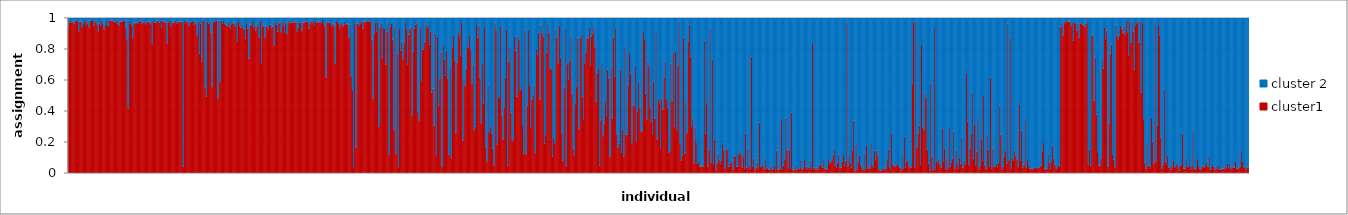
| Category | cluster1 | cluster 2 |
|---|---|---|
| 0 | 0.939 | 0.061 |
| 1 | 0.97 | 0.03 |
| 2 | 0.979 | 0.021 |
| 3 | 0.971 | 0.029 |
| 4 | 0.978 | 0.022 |
| 5 | 0.962 | 0.038 |
| 6 | 0.982 | 0.018 |
| 7 | 0.979 | 0.021 |
| 8 | 0.978 | 0.022 |
| 9 | 0.912 | 0.088 |
| 10 | 0.976 | 0.024 |
| 11 | 0.977 | 0.023 |
| 12 | 0.94 | 0.06 |
| 13 | 0.965 | 0.035 |
| 14 | 0.983 | 0.017 |
| 15 | 0.952 | 0.048 |
| 16 | 0.971 | 0.029 |
| 17 | 0.964 | 0.036 |
| 18 | 0.939 | 0.061 |
| 19 | 0.982 | 0.018 |
| 20 | 0.98 | 0.02 |
| 21 | 0.987 | 0.013 |
| 22 | 0.947 | 0.053 |
| 23 | 0.971 | 0.029 |
| 24 | 0.984 | 0.016 |
| 25 | 0.959 | 0.041 |
| 26 | 0.913 | 0.087 |
| 27 | 0.963 | 0.037 |
| 28 | 0.95 | 0.05 |
| 29 | 0.981 | 0.019 |
| 30 | 0.965 | 0.035 |
| 31 | 0.925 | 0.075 |
| 32 | 0.955 | 0.045 |
| 33 | 0.98 | 0.02 |
| 34 | 0.947 | 0.053 |
| 35 | 0.947 | 0.053 |
| 36 | 0.984 | 0.016 |
| 37 | 0.985 | 0.015 |
| 38 | 0.979 | 0.021 |
| 39 | 0.979 | 0.021 |
| 40 | 0.976 | 0.024 |
| 41 | 0.969 | 0.031 |
| 42 | 0.983 | 0.017 |
| 43 | 0.964 | 0.036 |
| 44 | 0.951 | 0.049 |
| 45 | 0.977 | 0.023 |
| 46 | 0.974 | 0.026 |
| 47 | 0.976 | 0.024 |
| 48 | 0.984 | 0.016 |
| 49 | 0.982 | 0.018 |
| 50 | 0.935 | 0.065 |
| 51 | 0.864 | 0.136 |
| 52 | 0.415 | 0.585 |
| 53 | 0.98 | 0.02 |
| 54 | 0.965 | 0.035 |
| 55 | 0.949 | 0.051 |
| 56 | 0.868 | 0.132 |
| 57 | 0.963 | 0.037 |
| 58 | 0.968 | 0.032 |
| 59 | 0.968 | 0.032 |
| 60 | 0.963 | 0.037 |
| 61 | 0.973 | 0.027 |
| 62 | 0.974 | 0.026 |
| 63 | 0.983 | 0.017 |
| 64 | 0.964 | 0.036 |
| 65 | 0.97 | 0.03 |
| 66 | 0.972 | 0.028 |
| 67 | 0.965 | 0.035 |
| 68 | 0.958 | 0.042 |
| 69 | 0.977 | 0.023 |
| 70 | 0.975 | 0.025 |
| 71 | 0.965 | 0.035 |
| 72 | 0.972 | 0.028 |
| 73 | 0.83 | 0.17 |
| 74 | 0.98 | 0.02 |
| 75 | 0.969 | 0.031 |
| 76 | 0.971 | 0.029 |
| 77 | 0.981 | 0.019 |
| 78 | 0.979 | 0.021 |
| 79 | 0.97 | 0.03 |
| 80 | 0.984 | 0.016 |
| 81 | 0.937 | 0.063 |
| 82 | 0.981 | 0.019 |
| 83 | 0.976 | 0.024 |
| 84 | 0.971 | 0.029 |
| 85 | 0.971 | 0.029 |
| 86 | 0.835 | 0.165 |
| 87 | 0.972 | 0.028 |
| 88 | 0.979 | 0.021 |
| 89 | 0.945 | 0.055 |
| 90 | 0.979 | 0.021 |
| 91 | 0.969 | 0.031 |
| 92 | 0.967 | 0.033 |
| 93 | 0.98 | 0.02 |
| 94 | 0.966 | 0.034 |
| 95 | 0.964 | 0.036 |
| 96 | 0.974 | 0.026 |
| 97 | 0.975 | 0.025 |
| 98 | 0.977 | 0.023 |
| 99 | 0.976 | 0.024 |
| 100 | 0.041 | 0.959 |
| 101 | 0.98 | 0.02 |
| 102 | 0.965 | 0.035 |
| 103 | 0.979 | 0.021 |
| 104 | 0.976 | 0.024 |
| 105 | 0.948 | 0.052 |
| 106 | 0.973 | 0.027 |
| 107 | 0.973 | 0.027 |
| 108 | 0.981 | 0.019 |
| 109 | 0.958 | 0.042 |
| 110 | 0.981 | 0.019 |
| 111 | 0.961 | 0.039 |
| 112 | 0.886 | 0.114 |
| 113 | 0.975 | 0.025 |
| 114 | 0.77 | 0.23 |
| 115 | 0.964 | 0.036 |
| 116 | 0.719 | 0.281 |
| 117 | 0.987 | 0.013 |
| 118 | 0.979 | 0.021 |
| 119 | 0.549 | 0.451 |
| 120 | 0.491 | 0.509 |
| 121 | 0.976 | 0.024 |
| 122 | 0.962 | 0.038 |
| 123 | 0.973 | 0.027 |
| 124 | 0.906 | 0.094 |
| 125 | 0.553 | 0.447 |
| 126 | 0.97 | 0.03 |
| 127 | 0.982 | 0.018 |
| 128 | 0.974 | 0.026 |
| 129 | 0.984 | 0.016 |
| 130 | 0.48 | 0.52 |
| 131 | 0.982 | 0.018 |
| 132 | 0.586 | 0.414 |
| 133 | 0.98 | 0.02 |
| 134 | 0.963 | 0.037 |
| 135 | 0.98 | 0.02 |
| 136 | 0.964 | 0.036 |
| 137 | 0.955 | 0.045 |
| 138 | 0.946 | 0.054 |
| 139 | 0.972 | 0.028 |
| 140 | 0.943 | 0.057 |
| 141 | 0.93 | 0.07 |
| 142 | 0.959 | 0.041 |
| 143 | 0.97 | 0.03 |
| 144 | 0.963 | 0.037 |
| 145 | 0.944 | 0.056 |
| 146 | 0.969 | 0.031 |
| 147 | 0.848 | 0.152 |
| 148 | 0.979 | 0.021 |
| 149 | 0.948 | 0.052 |
| 150 | 0.937 | 0.063 |
| 151 | 0.972 | 0.028 |
| 152 | 0.932 | 0.068 |
| 153 | 0.926 | 0.074 |
| 154 | 0.866 | 0.134 |
| 155 | 0.961 | 0.039 |
| 156 | 0.928 | 0.072 |
| 157 | 0.737 | 0.263 |
| 158 | 0.952 | 0.048 |
| 159 | 0.953 | 0.047 |
| 160 | 0.979 | 0.021 |
| 161 | 0.935 | 0.065 |
| 162 | 0.951 | 0.049 |
| 163 | 0.917 | 0.083 |
| 164 | 0.946 | 0.054 |
| 165 | 0.963 | 0.037 |
| 166 | 0.873 | 0.127 |
| 167 | 0.98 | 0.02 |
| 168 | 0.703 | 0.297 |
| 169 | 0.942 | 0.058 |
| 170 | 0.956 | 0.044 |
| 171 | 0.874 | 0.126 |
| 172 | 0.947 | 0.053 |
| 173 | 0.94 | 0.06 |
| 174 | 0.925 | 0.075 |
| 175 | 0.954 | 0.046 |
| 176 | 0.954 | 0.046 |
| 177 | 0.937 | 0.063 |
| 178 | 0.946 | 0.054 |
| 179 | 0.82 | 0.18 |
| 180 | 0.971 | 0.029 |
| 181 | 0.956 | 0.044 |
| 182 | 0.911 | 0.089 |
| 183 | 0.966 | 0.034 |
| 184 | 0.971 | 0.029 |
| 185 | 0.907 | 0.093 |
| 186 | 0.977 | 0.023 |
| 187 | 0.946 | 0.054 |
| 188 | 0.903 | 0.097 |
| 189 | 0.97 | 0.03 |
| 190 | 0.895 | 0.105 |
| 191 | 0.965 | 0.035 |
| 192 | 0.984 | 0.016 |
| 193 | 0.968 | 0.032 |
| 194 | 0.969 | 0.031 |
| 195 | 0.971 | 0.029 |
| 196 | 0.968 | 0.032 |
| 197 | 0.974 | 0.026 |
| 198 | 0.97 | 0.03 |
| 199 | 0.912 | 0.088 |
| 200 | 0.934 | 0.066 |
| 201 | 0.97 | 0.03 |
| 202 | 0.971 | 0.029 |
| 203 | 0.915 | 0.085 |
| 204 | 0.969 | 0.031 |
| 205 | 0.97 | 0.03 |
| 206 | 0.974 | 0.026 |
| 207 | 0.976 | 0.024 |
| 208 | 0.974 | 0.026 |
| 209 | 0.929 | 0.071 |
| 210 | 0.964 | 0.036 |
| 211 | 0.981 | 0.019 |
| 212 | 0.967 | 0.033 |
| 213 | 0.981 | 0.019 |
| 214 | 0.953 | 0.047 |
| 215 | 0.978 | 0.022 |
| 216 | 0.968 | 0.032 |
| 217 | 0.977 | 0.023 |
| 218 | 0.969 | 0.031 |
| 219 | 0.977 | 0.023 |
| 220 | 0.966 | 0.034 |
| 221 | 0.985 | 0.015 |
| 222 | 0.965 | 0.035 |
| 223 | 0.95 | 0.05 |
| 224 | 0.614 | 0.386 |
| 225 | 0.972 | 0.028 |
| 226 | 0.971 | 0.029 |
| 227 | 0.966 | 0.034 |
| 228 | 0.97 | 0.03 |
| 229 | 0.947 | 0.053 |
| 230 | 0.962 | 0.038 |
| 231 | 0.952 | 0.048 |
| 232 | 0.702 | 0.298 |
| 233 | 0.979 | 0.021 |
| 234 | 0.977 | 0.023 |
| 235 | 0.963 | 0.037 |
| 236 | 0.933 | 0.067 |
| 237 | 0.969 | 0.031 |
| 238 | 0.956 | 0.044 |
| 239 | 0.945 | 0.055 |
| 240 | 0.973 | 0.027 |
| 241 | 0.957 | 0.043 |
| 242 | 0.962 | 0.038 |
| 243 | 0.957 | 0.043 |
| 244 | 0.873 | 0.127 |
| 245 | 0.953 | 0.047 |
| 246 | 0.625 | 0.375 |
| 247 | 0.533 | 0.467 |
| 248 | 0.03 | 0.97 |
| 249 | 0.966 | 0.034 |
| 250 | 0.161 | 0.839 |
| 251 | 0.964 | 0.036 |
| 252 | 0.965 | 0.035 |
| 253 | 0.952 | 0.048 |
| 254 | 0.965 | 0.035 |
| 255 | 0.976 | 0.024 |
| 256 | 0.931 | 0.069 |
| 257 | 0.977 | 0.023 |
| 258 | 0.974 | 0.026 |
| 259 | 0.975 | 0.025 |
| 260 | 0.981 | 0.019 |
| 261 | 0.976 | 0.024 |
| 262 | 0.978 | 0.022 |
| 263 | 0.978 | 0.022 |
| 264 | 0.857 | 0.143 |
| 265 | 0.478 | 0.522 |
| 266 | 0.9 | 0.1 |
| 267 | 0.969 | 0.031 |
| 268 | 0.909 | 0.091 |
| 269 | 0.97 | 0.03 |
| 270 | 0.298 | 0.702 |
| 271 | 0.94 | 0.06 |
| 272 | 0.962 | 0.038 |
| 273 | 0.741 | 0.259 |
| 274 | 0.934 | 0.066 |
| 275 | 0.928 | 0.072 |
| 276 | 0.698 | 0.302 |
| 277 | 0.908 | 0.092 |
| 278 | 0.968 | 0.032 |
| 279 | 0.117 | 0.883 |
| 280 | 0.94 | 0.06 |
| 281 | 0.962 | 0.038 |
| 282 | 0.859 | 0.141 |
| 283 | 0.276 | 0.724 |
| 284 | 0.944 | 0.056 |
| 285 | 0.121 | 0.879 |
| 286 | 0.768 | 0.232 |
| 287 | 0.038 | 0.962 |
| 288 | 0.927 | 0.073 |
| 289 | 0.79 | 0.21 |
| 290 | 0.847 | 0.153 |
| 291 | 0.734 | 0.266 |
| 292 | 0.835 | 0.165 |
| 293 | 0.973 | 0.027 |
| 294 | 0.927 | 0.073 |
| 295 | 0.696 | 0.304 |
| 296 | 0.892 | 0.108 |
| 297 | 0.928 | 0.072 |
| 298 | 0.943 | 0.057 |
| 299 | 0.366 | 0.634 |
| 300 | 0.783 | 0.217 |
| 301 | 0.929 | 0.071 |
| 302 | 0.957 | 0.043 |
| 303 | 0.965 | 0.035 |
| 304 | 0.394 | 0.606 |
| 305 | 0.338 | 0.662 |
| 306 | 0.945 | 0.055 |
| 307 | 0.593 | 0.407 |
| 308 | 0.795 | 0.205 |
| 309 | 0.794 | 0.206 |
| 310 | 0.847 | 0.153 |
| 311 | 0.959 | 0.041 |
| 312 | 0.934 | 0.066 |
| 313 | 0.954 | 0.046 |
| 314 | 0.826 | 0.174 |
| 315 | 0.911 | 0.089 |
| 316 | 0.518 | 0.482 |
| 317 | 0.543 | 0.457 |
| 318 | 0.303 | 0.697 |
| 319 | 0.899 | 0.101 |
| 320 | 0.108 | 0.892 |
| 321 | 0.879 | 0.121 |
| 322 | 0.432 | 0.568 |
| 323 | 0.605 | 0.395 |
| 324 | 0.779 | 0.221 |
| 325 | 0.038 | 0.962 |
| 326 | 0.823 | 0.177 |
| 327 | 0.731 | 0.269 |
| 328 | 0.628 | 0.372 |
| 329 | 0.786 | 0.214 |
| 330 | 0.606 | 0.394 |
| 331 | 0.117 | 0.883 |
| 332 | 0.678 | 0.322 |
| 333 | 0.098 | 0.902 |
| 334 | 0.805 | 0.195 |
| 335 | 0.887 | 0.113 |
| 336 | 0.726 | 0.274 |
| 337 | 0.255 | 0.745 |
| 338 | 0.71 | 0.29 |
| 339 | 0.911 | 0.089 |
| 340 | 0.882 | 0.118 |
| 341 | 0.753 | 0.247 |
| 342 | 0.971 | 0.029 |
| 343 | 0.207 | 0.793 |
| 344 | 0.603 | 0.397 |
| 345 | 0.562 | 0.438 |
| 346 | 0.669 | 0.331 |
| 347 | 0.816 | 0.184 |
| 348 | 0.806 | 0.194 |
| 349 | 0.889 | 0.111 |
| 350 | 0.792 | 0.208 |
| 351 | 0.576 | 0.424 |
| 352 | 0.696 | 0.304 |
| 353 | 0.274 | 0.726 |
| 354 | 0.298 | 0.702 |
| 355 | 0.952 | 0.048 |
| 356 | 0.873 | 0.127 |
| 357 | 0.948 | 0.052 |
| 358 | 0.61 | 0.39 |
| 359 | 0.32 | 0.68 |
| 360 | 0.703 | 0.297 |
| 361 | 0.446 | 0.554 |
| 362 | 0.94 | 0.06 |
| 363 | 0.165 | 0.835 |
| 364 | 0.073 | 0.927 |
| 365 | 0.568 | 0.432 |
| 366 | 0.263 | 0.737 |
| 367 | 0.299 | 0.701 |
| 368 | 0.251 | 0.749 |
| 369 | 0.156 | 0.844 |
| 370 | 0.048 | 0.952 |
| 371 | 0.968 | 0.032 |
| 372 | 0.919 | 0.081 |
| 373 | 0.182 | 0.818 |
| 374 | 0.488 | 0.512 |
| 375 | 0.482 | 0.518 |
| 376 | 0.947 | 0.053 |
| 377 | 0.369 | 0.631 |
| 378 | 0.215 | 0.785 |
| 379 | 0.422 | 0.578 |
| 380 | 0.615 | 0.385 |
| 381 | 0.925 | 0.075 |
| 382 | 0.047 | 0.953 |
| 383 | 0.714 | 0.286 |
| 384 | 0.809 | 0.191 |
| 385 | 0.386 | 0.614 |
| 386 | 0.201 | 0.799 |
| 387 | 0.217 | 0.783 |
| 388 | 0.879 | 0.121 |
| 389 | 0.789 | 0.211 |
| 390 | 0.491 | 0.509 |
| 391 | 0.882 | 0.118 |
| 392 | 0.857 | 0.143 |
| 393 | 0.534 | 0.466 |
| 394 | 0.54 | 0.46 |
| 395 | 0.301 | 0.699 |
| 396 | 0.124 | 0.876 |
| 397 | 0.921 | 0.079 |
| 398 | 0.12 | 0.88 |
| 399 | 0.432 | 0.568 |
| 400 | 0.921 | 0.079 |
| 401 | 0.56 | 0.44 |
| 402 | 0.294 | 0.706 |
| 403 | 0.472 | 0.528 |
| 404 | 0.499 | 0.501 |
| 405 | 0.565 | 0.435 |
| 406 | 0.127 | 0.873 |
| 407 | 0.798 | 0.202 |
| 408 | 0.763 | 0.237 |
| 409 | 0.906 | 0.094 |
| 410 | 0.471 | 0.529 |
| 411 | 0.955 | 0.045 |
| 412 | 0.902 | 0.098 |
| 413 | 0.88 | 0.12 |
| 414 | 0.189 | 0.811 |
| 415 | 0.243 | 0.757 |
| 416 | 0.777 | 0.223 |
| 417 | 0.959 | 0.041 |
| 418 | 0.905 | 0.095 |
| 419 | 0.673 | 0.327 |
| 420 | 0.668 | 0.332 |
| 421 | 0.105 | 0.895 |
| 422 | 0.226 | 0.774 |
| 423 | 0.191 | 0.809 |
| 424 | 0.924 | 0.076 |
| 425 | 0.87 | 0.13 |
| 426 | 0.706 | 0.294 |
| 427 | 0.948 | 0.052 |
| 428 | 0.743 | 0.257 |
| 429 | 0.257 | 0.743 |
| 430 | 0.077 | 0.923 |
| 431 | 0.547 | 0.453 |
| 432 | 0.932 | 0.068 |
| 433 | 0.043 | 0.957 |
| 434 | 0.701 | 0.299 |
| 435 | 0.6 | 0.4 |
| 436 | 0.72 | 0.28 |
| 437 | 0.877 | 0.123 |
| 438 | 0.508 | 0.492 |
| 439 | 0.156 | 0.844 |
| 440 | 0.108 | 0.892 |
| 441 | 0.444 | 0.556 |
| 442 | 0.554 | 0.446 |
| 443 | 0.871 | 0.129 |
| 444 | 0.281 | 0.719 |
| 445 | 0.871 | 0.129 |
| 446 | 0.89 | 0.11 |
| 447 | 0.489 | 0.511 |
| 448 | 0.341 | 0.659 |
| 449 | 0.708 | 0.292 |
| 450 | 0.777 | 0.223 |
| 451 | 0.869 | 0.131 |
| 452 | 0.868 | 0.132 |
| 453 | 0.936 | 0.064 |
| 454 | 0.69 | 0.31 |
| 455 | 0.88 | 0.12 |
| 456 | 0.9 | 0.1 |
| 457 | 0.946 | 0.054 |
| 458 | 0.811 | 0.189 |
| 459 | 0.454 | 0.546 |
| 460 | 0.645 | 0.355 |
| 461 | 0.669 | 0.331 |
| 462 | 0.047 | 0.953 |
| 463 | 0.34 | 0.66 |
| 464 | 0.713 | 0.287 |
| 465 | 0.237 | 0.763 |
| 466 | 0.316 | 0.684 |
| 467 | 0.456 | 0.544 |
| 468 | 0.368 | 0.632 |
| 469 | 0.666 | 0.334 |
| 470 | 0.611 | 0.389 |
| 471 | 0.104 | 0.896 |
| 472 | 0.678 | 0.322 |
| 473 | 0.348 | 0.652 |
| 474 | 0.87 | 0.13 |
| 475 | 0.621 | 0.379 |
| 476 | 0.934 | 0.066 |
| 477 | 0.249 | 0.751 |
| 478 | 0.161 | 0.839 |
| 479 | 0.188 | 0.812 |
| 480 | 0.667 | 0.333 |
| 481 | 0.128 | 0.872 |
| 482 | 0.276 | 0.724 |
| 483 | 0.106 | 0.894 |
| 484 | 0.816 | 0.184 |
| 485 | 0.244 | 0.756 |
| 486 | 0.245 | 0.755 |
| 487 | 0.56 | 0.44 |
| 488 | 0.772 | 0.228 |
| 489 | 0.639 | 0.361 |
| 490 | 0.192 | 0.808 |
| 491 | 0.441 | 0.559 |
| 492 | 0.43 | 0.57 |
| 493 | 0.689 | 0.311 |
| 494 | 0.201 | 0.799 |
| 495 | 0.392 | 0.608 |
| 496 | 0.585 | 0.415 |
| 497 | 0.422 | 0.578 |
| 498 | 0.264 | 0.736 |
| 499 | 0.269 | 0.731 |
| 500 | 0.912 | 0.088 |
| 501 | 0.863 | 0.137 |
| 502 | 0.51 | 0.49 |
| 503 | 0.344 | 0.656 |
| 504 | 0.717 | 0.283 |
| 505 | 0.686 | 0.314 |
| 506 | 0.421 | 0.579 |
| 507 | 0.327 | 0.673 |
| 508 | 0.253 | 0.747 |
| 509 | 0.591 | 0.409 |
| 510 | 0.348 | 0.652 |
| 511 | 0.925 | 0.075 |
| 512 | 0.214 | 0.786 |
| 513 | 0.478 | 0.522 |
| 514 | 0.456 | 0.544 |
| 515 | 0.158 | 0.842 |
| 516 | 0.477 | 0.523 |
| 517 | 0.409 | 0.591 |
| 518 | 0.615 | 0.385 |
| 519 | 0.719 | 0.281 |
| 520 | 0.474 | 0.526 |
| 521 | 0.419 | 0.581 |
| 522 | 0.128 | 0.872 |
| 523 | 0.135 | 0.865 |
| 524 | 0.707 | 0.293 |
| 525 | 0.461 | 0.539 |
| 526 | 0.773 | 0.227 |
| 527 | 0.296 | 0.704 |
| 528 | 0.78 | 0.22 |
| 529 | 0.276 | 0.724 |
| 530 | 0.693 | 0.307 |
| 531 | 0.977 | 0.023 |
| 532 | 0.186 | 0.814 |
| 533 | 0.078 | 0.922 |
| 534 | 0.111 | 0.889 |
| 535 | 0.872 | 0.128 |
| 536 | 0.122 | 0.878 |
| 537 | 0.456 | 0.544 |
| 538 | 0.256 | 0.744 |
| 539 | 0.849 | 0.151 |
| 540 | 0.955 | 0.045 |
| 541 | 0.748 | 0.252 |
| 542 | 0.295 | 0.705 |
| 543 | 0.349 | 0.651 |
| 544 | 0.061 | 0.939 |
| 545 | 0.29 | 0.71 |
| 546 | 0.197 | 0.803 |
| 547 | 0.061 | 0.939 |
| 548 | 0.071 | 0.929 |
| 549 | 0.042 | 0.958 |
| 550 | 0.039 | 0.961 |
| 551 | 0.045 | 0.955 |
| 552 | 0.041 | 0.959 |
| 553 | 0.852 | 0.148 |
| 554 | 0.252 | 0.748 |
| 555 | 0.452 | 0.548 |
| 556 | 0.04 | 0.96 |
| 557 | 0.146 | 0.854 |
| 558 | 0.933 | 0.067 |
| 559 | 0.066 | 0.934 |
| 560 | 0.729 | 0.271 |
| 561 | 0.056 | 0.944 |
| 562 | 0.211 | 0.789 |
| 563 | 0.017 | 0.983 |
| 564 | 0.065 | 0.935 |
| 565 | 0.124 | 0.876 |
| 566 | 0.086 | 0.914 |
| 567 | 0.056 | 0.944 |
| 568 | 0.079 | 0.921 |
| 569 | 0.186 | 0.814 |
| 570 | 0.148 | 0.852 |
| 571 | 0.029 | 0.971 |
| 572 | 0.158 | 0.842 |
| 573 | 0.147 | 0.853 |
| 574 | 0.038 | 0.962 |
| 575 | 0.041 | 0.959 |
| 576 | 0.066 | 0.934 |
| 577 | 0.076 | 0.924 |
| 578 | 0.021 | 0.979 |
| 579 | 0.111 | 0.889 |
| 580 | 0.106 | 0.894 |
| 581 | 0.038 | 0.962 |
| 582 | 0.039 | 0.961 |
| 583 | 0.125 | 0.875 |
| 584 | 0.147 | 0.853 |
| 585 | 0.114 | 0.886 |
| 586 | 0.033 | 0.967 |
| 587 | 0.107 | 0.893 |
| 588 | 0.025 | 0.975 |
| 589 | 0.254 | 0.746 |
| 590 | 0.032 | 0.968 |
| 591 | 0.155 | 0.845 |
| 592 | 0.043 | 0.957 |
| 593 | 0.023 | 0.977 |
| 594 | 0.748 | 0.252 |
| 595 | 0.037 | 0.963 |
| 596 | 0.092 | 0.908 |
| 597 | 0.017 | 0.983 |
| 598 | 0.035 | 0.965 |
| 599 | 0.065 | 0.935 |
| 600 | 0.029 | 0.971 |
| 601 | 0.324 | 0.676 |
| 602 | 0.037 | 0.963 |
| 603 | 0.045 | 0.955 |
| 604 | 0.056 | 0.944 |
| 605 | 0.022 | 0.978 |
| 606 | 0.091 | 0.909 |
| 607 | 0.028 | 0.972 |
| 608 | 0.033 | 0.967 |
| 609 | 0.02 | 0.98 |
| 610 | 0.023 | 0.977 |
| 611 | 0.046 | 0.954 |
| 612 | 0.021 | 0.979 |
| 613 | 0.025 | 0.975 |
| 614 | 0.05 | 0.95 |
| 615 | 0.016 | 0.984 |
| 616 | 0.142 | 0.858 |
| 617 | 0.019 | 0.981 |
| 618 | 0.023 | 0.977 |
| 619 | 0.027 | 0.973 |
| 620 | 0.347 | 0.653 |
| 621 | 0.018 | 0.982 |
| 622 | 0.046 | 0.954 |
| 623 | 0.087 | 0.913 |
| 624 | 0.356 | 0.644 |
| 625 | 0.145 | 0.855 |
| 626 | 0.031 | 0.969 |
| 627 | 0.149 | 0.851 |
| 628 | 0.024 | 0.976 |
| 629 | 0.389 | 0.611 |
| 630 | 0.017 | 0.983 |
| 631 | 0.02 | 0.98 |
| 632 | 0.05 | 0.95 |
| 633 | 0.018 | 0.982 |
| 634 | 0.02 | 0.98 |
| 635 | 0.03 | 0.97 |
| 636 | 0.028 | 0.972 |
| 637 | 0.082 | 0.918 |
| 638 | 0.023 | 0.977 |
| 639 | 0.027 | 0.973 |
| 640 | 0.088 | 0.912 |
| 641 | 0.036 | 0.964 |
| 642 | 0.021 | 0.979 |
| 643 | 0.041 | 0.959 |
| 644 | 0.032 | 0.968 |
| 645 | 0.079 | 0.921 |
| 646 | 0.029 | 0.971 |
| 647 | 0.842 | 0.158 |
| 648 | 0.022 | 0.978 |
| 649 | 0.033 | 0.967 |
| 650 | 0.021 | 0.979 |
| 651 | 0.032 | 0.968 |
| 652 | 0.02 | 0.98 |
| 653 | 0.049 | 0.951 |
| 654 | 0.055 | 0.945 |
| 655 | 0.042 | 0.958 |
| 656 | 0.032 | 0.968 |
| 657 | 0.089 | 0.911 |
| 658 | 0.026 | 0.974 |
| 659 | 0.025 | 0.975 |
| 660 | 0.021 | 0.979 |
| 661 | 0.081 | 0.919 |
| 662 | 0.057 | 0.943 |
| 663 | 0.069 | 0.931 |
| 664 | 0.081 | 0.919 |
| 665 | 0.115 | 0.885 |
| 666 | 0.154 | 0.846 |
| 667 | 0.046 | 0.954 |
| 668 | 0.033 | 0.967 |
| 669 | 0.067 | 0.933 |
| 670 | 0.115 | 0.885 |
| 671 | 0.03 | 0.97 |
| 672 | 0.034 | 0.966 |
| 673 | 0.071 | 0.929 |
| 674 | 0.115 | 0.885 |
| 675 | 0.042 | 0.958 |
| 676 | 0.078 | 0.922 |
| 677 | 0.97 | 0.03 |
| 678 | 0.043 | 0.957 |
| 679 | 0.116 | 0.884 |
| 680 | 0.065 | 0.935 |
| 681 | 0.032 | 0.968 |
| 682 | 0.145 | 0.855 |
| 683 | 0.337 | 0.663 |
| 684 | 0.013 | 0.987 |
| 685 | 0.186 | 0.814 |
| 686 | 0.018 | 0.982 |
| 687 | 0.069 | 0.931 |
| 688 | 0.11 | 0.89 |
| 689 | 0.05 | 0.95 |
| 690 | 0.03 | 0.97 |
| 691 | 0.021 | 0.979 |
| 692 | 0.127 | 0.873 |
| 693 | 0.017 | 0.983 |
| 694 | 0.176 | 0.824 |
| 695 | 0.029 | 0.971 |
| 696 | 0.025 | 0.975 |
| 697 | 0.031 | 0.969 |
| 698 | 0.196 | 0.804 |
| 699 | 0.053 | 0.947 |
| 700 | 0.036 | 0.964 |
| 701 | 0.143 | 0.857 |
| 702 | 0.083 | 0.917 |
| 703 | 0.142 | 0.858 |
| 704 | 0.111 | 0.889 |
| 705 | 0.017 | 0.983 |
| 706 | 0.016 | 0.984 |
| 707 | 0.013 | 0.987 |
| 708 | 0.028 | 0.972 |
| 709 | 0.017 | 0.983 |
| 710 | 0.031 | 0.969 |
| 711 | 0.024 | 0.976 |
| 712 | 0.083 | 0.917 |
| 713 | 0.151 | 0.849 |
| 714 | 0.036 | 0.964 |
| 715 | 0.016 | 0.984 |
| 716 | 0.255 | 0.745 |
| 717 | 0.058 | 0.942 |
| 718 | 0.045 | 0.955 |
| 719 | 0.042 | 0.958 |
| 720 | 0.048 | 0.952 |
| 721 | 0.059 | 0.941 |
| 722 | 0.044 | 0.956 |
| 723 | 0.034 | 0.966 |
| 724 | 0.015 | 0.985 |
| 725 | 0.117 | 0.883 |
| 726 | 0.028 | 0.972 |
| 727 | 0.231 | 0.769 |
| 728 | 0.034 | 0.966 |
| 729 | 0.071 | 0.929 |
| 730 | 0.082 | 0.918 |
| 731 | 0.041 | 0.959 |
| 732 | 0.032 | 0.968 |
| 733 | 0.036 | 0.964 |
| 734 | 0.573 | 0.427 |
| 735 | 0.97 | 0.03 |
| 736 | 0.036 | 0.964 |
| 737 | 0.975 | 0.025 |
| 738 | 0.163 | 0.837 |
| 739 | 0.25 | 0.75 |
| 740 | 0.304 | 0.696 |
| 741 | 0.051 | 0.949 |
| 742 | 0.825 | 0.175 |
| 743 | 0.293 | 0.707 |
| 744 | 0.276 | 0.724 |
| 745 | 0.514 | 0.486 |
| 746 | 0.486 | 0.514 |
| 747 | 0.146 | 0.854 |
| 748 | 0.058 | 0.942 |
| 749 | 0.014 | 0.986 |
| 750 | 0.577 | 0.423 |
| 751 | 0.103 | 0.897 |
| 752 | 0.019 | 0.981 |
| 753 | 0.941 | 0.059 |
| 754 | 0.018 | 0.982 |
| 755 | 0.077 | 0.923 |
| 756 | 0.064 | 0.936 |
| 757 | 0.091 | 0.909 |
| 758 | 0.053 | 0.947 |
| 759 | 0.034 | 0.966 |
| 760 | 0.287 | 0.713 |
| 761 | 0.075 | 0.925 |
| 762 | 0.153 | 0.847 |
| 763 | 0.022 | 0.978 |
| 764 | 0.092 | 0.908 |
| 765 | 0.028 | 0.972 |
| 766 | 0.292 | 0.708 |
| 767 | 0.04 | 0.96 |
| 768 | 0.067 | 0.933 |
| 769 | 0.091 | 0.909 |
| 770 | 0.265 | 0.735 |
| 771 | 0.027 | 0.973 |
| 772 | 0.151 | 0.849 |
| 773 | 0.056 | 0.944 |
| 774 | 0.023 | 0.977 |
| 775 | 0.095 | 0.905 |
| 776 | 0.06 | 0.94 |
| 777 | 0.227 | 0.773 |
| 778 | 0.032 | 0.968 |
| 779 | 0.079 | 0.921 |
| 780 | 0.056 | 0.944 |
| 781 | 0.642 | 0.358 |
| 782 | 0.331 | 0.669 |
| 783 | 0.05 | 0.95 |
| 784 | 0.159 | 0.841 |
| 785 | 0.252 | 0.748 |
| 786 | 0.518 | 0.482 |
| 787 | 0.09 | 0.91 |
| 788 | 0.312 | 0.688 |
| 789 | 0.049 | 0.951 |
| 790 | 0.137 | 0.863 |
| 791 | 0.353 | 0.647 |
| 792 | 0.022 | 0.978 |
| 793 | 0.043 | 0.957 |
| 794 | 0.222 | 0.778 |
| 795 | 0.08 | 0.92 |
| 796 | 0.5 | 0.5 |
| 797 | 0.05 | 0.95 |
| 798 | 0.024 | 0.976 |
| 799 | 0.239 | 0.761 |
| 800 | 0.149 | 0.851 |
| 801 | 0.041 | 0.959 |
| 802 | 0.613 | 0.387 |
| 803 | 0.029 | 0.971 |
| 804 | 0.158 | 0.842 |
| 805 | 0.043 | 0.957 |
| 806 | 0.04 | 0.96 |
| 807 | 0.059 | 0.941 |
| 808 | 0.035 | 0.965 |
| 809 | 0.062 | 0.938 |
| 810 | 0.433 | 0.567 |
| 811 | 0.245 | 0.755 |
| 812 | 0.023 | 0.977 |
| 813 | 0.042 | 0.958 |
| 814 | 0.107 | 0.893 |
| 815 | 0.144 | 0.856 |
| 816 | 0.059 | 0.941 |
| 817 | 0.961 | 0.039 |
| 818 | 0.081 | 0.919 |
| 819 | 0.874 | 0.126 |
| 820 | 0.029 | 0.971 |
| 821 | 0.094 | 0.906 |
| 822 | 0.081 | 0.919 |
| 823 | 0.142 | 0.858 |
| 824 | 0.111 | 0.889 |
| 825 | 0.083 | 0.917 |
| 826 | 0.037 | 0.963 |
| 827 | 0.442 | 0.558 |
| 828 | 0.08 | 0.92 |
| 829 | 0.273 | 0.727 |
| 830 | 0.034 | 0.966 |
| 831 | 0.055 | 0.945 |
| 832 | 0.348 | 0.652 |
| 833 | 0.031 | 0.969 |
| 834 | 0.088 | 0.912 |
| 835 | 0.048 | 0.952 |
| 836 | 0.028 | 0.972 |
| 837 | 0.029 | 0.971 |
| 838 | 0.023 | 0.977 |
| 839 | 0.026 | 0.974 |
| 840 | 0.032 | 0.968 |
| 841 | 0.031 | 0.969 |
| 842 | 0.024 | 0.976 |
| 843 | 0.036 | 0.964 |
| 844 | 0.031 | 0.969 |
| 845 | 0.043 | 0.957 |
| 846 | 0.046 | 0.954 |
| 847 | 0.136 | 0.864 |
| 848 | 0.193 | 0.807 |
| 849 | 0.021 | 0.979 |
| 850 | 0.026 | 0.974 |
| 851 | 0.025 | 0.975 |
| 852 | 0.12 | 0.88 |
| 853 | 0.065 | 0.935 |
| 854 | 0.026 | 0.974 |
| 855 | 0.07 | 0.93 |
| 856 | 0.175 | 0.825 |
| 857 | 0.09 | 0.91 |
| 858 | 0.053 | 0.947 |
| 859 | 0.024 | 0.976 |
| 860 | 0.036 | 0.964 |
| 861 | 0.052 | 0.948 |
| 862 | 0.04 | 0.96 |
| 863 | 0.943 | 0.057 |
| 864 | 0.969 | 0.031 |
| 865 | 0.885 | 0.115 |
| 866 | 0.974 | 0.026 |
| 867 | 0.964 | 0.036 |
| 868 | 0.982 | 0.018 |
| 869 | 0.976 | 0.024 |
| 870 | 0.976 | 0.024 |
| 871 | 0.977 | 0.023 |
| 872 | 0.951 | 0.049 |
| 873 | 0.97 | 0.03 |
| 874 | 0.852 | 0.148 |
| 875 | 0.967 | 0.033 |
| 876 | 0.965 | 0.035 |
| 877 | 0.918 | 0.082 |
| 878 | 0.962 | 0.038 |
| 879 | 0.873 | 0.127 |
| 880 | 0.964 | 0.036 |
| 881 | 0.965 | 0.035 |
| 882 | 0.955 | 0.045 |
| 883 | 0.952 | 0.048 |
| 884 | 0.942 | 0.058 |
| 885 | 0.961 | 0.039 |
| 886 | 0.98 | 0.02 |
| 887 | 0.054 | 0.946 |
| 888 | 0.148 | 0.852 |
| 889 | 0.045 | 0.955 |
| 890 | 0.889 | 0.111 |
| 891 | 0.885 | 0.115 |
| 892 | 0.466 | 0.534 |
| 893 | 0.744 | 0.256 |
| 894 | 0.375 | 0.625 |
| 895 | 0.134 | 0.866 |
| 896 | 0.047 | 0.953 |
| 897 | 0.047 | 0.953 |
| 898 | 0.094 | 0.906 |
| 899 | 0.735 | 0.265 |
| 900 | 0.672 | 0.328 |
| 901 | 0.939 | 0.061 |
| 902 | 0.862 | 0.138 |
| 903 | 0.919 | 0.081 |
| 904 | 0.038 | 0.962 |
| 905 | 0.318 | 0.682 |
| 906 | 0.768 | 0.232 |
| 907 | 0.828 | 0.172 |
| 908 | 0.115 | 0.885 |
| 909 | 0.084 | 0.916 |
| 910 | 0.036 | 0.964 |
| 911 | 0.957 | 0.043 |
| 912 | 0.885 | 0.115 |
| 913 | 0.861 | 0.139 |
| 914 | 0.882 | 0.118 |
| 915 | 0.948 | 0.052 |
| 916 | 0.932 | 0.068 |
| 917 | 0.905 | 0.095 |
| 918 | 0.944 | 0.056 |
| 919 | 0.893 | 0.107 |
| 920 | 0.984 | 0.016 |
| 921 | 0.907 | 0.093 |
| 922 | 0.753 | 0.247 |
| 923 | 0.978 | 0.022 |
| 924 | 0.841 | 0.159 |
| 925 | 0.972 | 0.028 |
| 926 | 0.911 | 0.089 |
| 927 | 0.664 | 0.336 |
| 928 | 0.958 | 0.042 |
| 929 | 0.965 | 0.035 |
| 930 | 0.976 | 0.024 |
| 931 | 0.84 | 0.16 |
| 932 | 0.982 | 0.018 |
| 933 | 0.518 | 0.482 |
| 934 | 0.968 | 0.032 |
| 935 | 0.34 | 0.66 |
| 936 | 0.064 | 0.936 |
| 937 | 0.025 | 0.975 |
| 938 | 0.192 | 0.808 |
| 939 | 0.046 | 0.954 |
| 940 | 0.048 | 0.952 |
| 941 | 0.029 | 0.971 |
| 942 | 0.354 | 0.646 |
| 943 | 0.2 | 0.8 |
| 944 | 0.061 | 0.939 |
| 945 | 0.973 | 0.027 |
| 946 | 0.074 | 0.926 |
| 947 | 0.306 | 0.694 |
| 948 | 0.958 | 0.042 |
| 949 | 0.889 | 0.111 |
| 950 | 0.23 | 0.77 |
| 951 | 0.029 | 0.971 |
| 952 | 0.055 | 0.945 |
| 953 | 0.536 | 0.464 |
| 954 | 0.071 | 0.929 |
| 955 | 0.051 | 0.949 |
| 956 | 0.114 | 0.886 |
| 957 | 0.032 | 0.968 |
| 958 | 0.049 | 0.951 |
| 959 | 0.019 | 0.981 |
| 960 | 0.042 | 0.958 |
| 961 | 0.08 | 0.92 |
| 962 | 0.034 | 0.966 |
| 963 | 0.048 | 0.952 |
| 964 | 0.063 | 0.937 |
| 965 | 0.042 | 0.958 |
| 966 | 0.016 | 0.984 |
| 967 | 0.048 | 0.952 |
| 968 | 0.055 | 0.945 |
| 969 | 0.253 | 0.747 |
| 970 | 0.028 | 0.972 |
| 971 | 0.026 | 0.974 |
| 972 | 0.091 | 0.909 |
| 973 | 0.041 | 0.959 |
| 974 | 0.037 | 0.963 |
| 975 | 0.05 | 0.95 |
| 976 | 0.022 | 0.978 |
| 977 | 0.047 | 0.953 |
| 978 | 0.27 | 0.73 |
| 979 | 0.026 | 0.974 |
| 980 | 0.029 | 0.971 |
| 981 | 0.022 | 0.978 |
| 982 | 0.093 | 0.907 |
| 983 | 0.048 | 0.952 |
| 984 | 0.026 | 0.974 |
| 985 | 0.024 | 0.976 |
| 986 | 0.039 | 0.961 |
| 987 | 0.038 | 0.962 |
| 988 | 0.035 | 0.965 |
| 989 | 0.049 | 0.951 |
| 990 | 0.072 | 0.928 |
| 991 | 0.039 | 0.961 |
| 992 | 0.11 | 0.89 |
| 993 | 0.022 | 0.978 |
| 994 | 0.024 | 0.976 |
| 995 | 0.053 | 0.947 |
| 996 | 0.041 | 0.959 |
| 997 | 0.021 | 0.979 |
| 998 | 0.041 | 0.959 |
| 999 | 0.025 | 0.975 |
| 1000 | 0.049 | 0.951 |
| 1001 | 0.022 | 0.978 |
| 1002 | 0.02 | 0.98 |
| 1003 | 0.027 | 0.973 |
| 1004 | 0.024 | 0.976 |
| 1005 | 0.026 | 0.974 |
| 1006 | 0.037 | 0.963 |
| 1007 | 0.023 | 0.977 |
| 1008 | 0.058 | 0.942 |
| 1009 | 0.031 | 0.969 |
| 1010 | 0.063 | 0.937 |
| 1011 | 0.028 | 0.972 |
| 1012 | 0.038 | 0.962 |
| 1013 | 0.034 | 0.966 |
| 1014 | 0.033 | 0.967 |
| 1015 | 0.072 | 0.928 |
| 1016 | 0.028 | 0.972 |
| 1017 | 0.024 | 0.976 |
| 1018 | 0.036 | 0.964 |
| 1019 | 0.042 | 0.958 |
| 1020 | 0.14 | 0.86 |
| 1021 | 0.072 | 0.928 |
| 1022 | 0.03 | 0.97 |
| 1023 | 0.039 | 0.961 |
| 1024 | 0.023 | 0.977 |
| 1025 | 0.032 | 0.968 |
| 1026 | 0.037 | 0.963 |